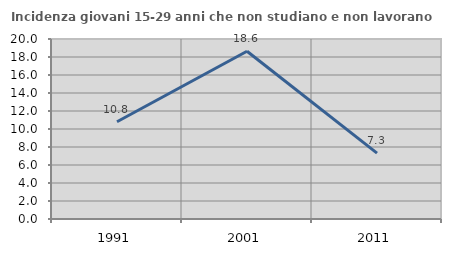
| Category | Incidenza giovani 15-29 anni che non studiano e non lavorano  |
|---|---|
| 1991.0 | 10.811 |
| 2001.0 | 18.644 |
| 2011.0 | 7.317 |